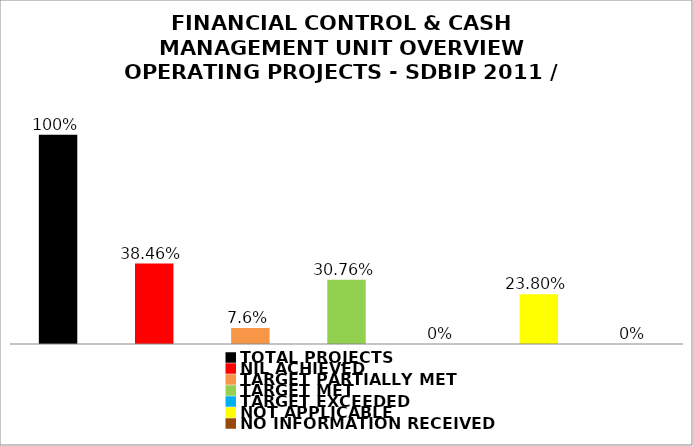
| Category | Series 0 |
|---|---|
| TOTAL PROJECTS | 1 |
| NIL ACHIEVED | 0.385 |
| TARGET PARTIALLY MET | 0.076 |
| TARGET MET | 0.308 |
| TARGET EXCEEDED | 0 |
| NOT APPLICABLE | 0.238 |
| NO INFORMATION RECEIVED | 0 |